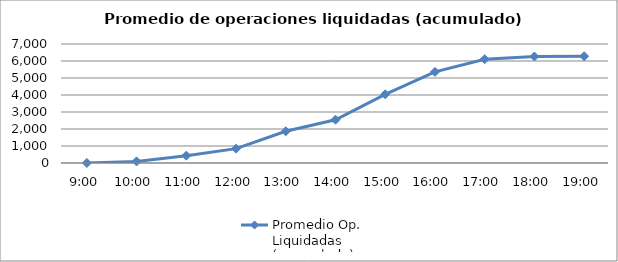
| Category | Promedio Op.
Liquidadas 
(acumulado) |
|---|---|
| 0.375 | 4.1 |
| 0.4166666666666667 | 93.55 |
| 0.4583333333333333 | 431.8 |
| 0.5 | 843.7 |
| 0.5416666666666666 | 1867.95 |
| 0.583333333333333 | 2545.5 |
| 0.625 | 4041.7 |
| 0.666666666666667 | 5358.9 |
| 0.708333333333333 | 6105.15 |
| 0.75 | 6265.15 |
| 0.791666666666667 | 6282.6 |